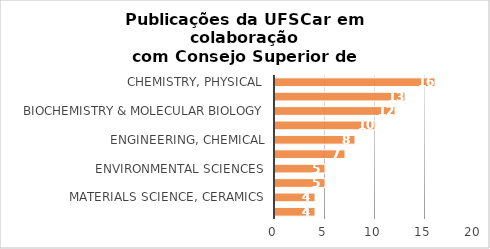
| Category | # Records |
|---|---|
| chemistry, physical | 16 |
| biotechnology & applied microbiology | 13 |
| biochemistry & molecular biology | 12 |
| materials science, multidisciplinary | 10 |
| engineering, chemical | 8 |
| ecology | 7 |
| environmental sciences | 5 |
| microbiology | 5 |
| materials science, ceramics | 4 |
| metallurgy & metallurgical engineering | 4 |